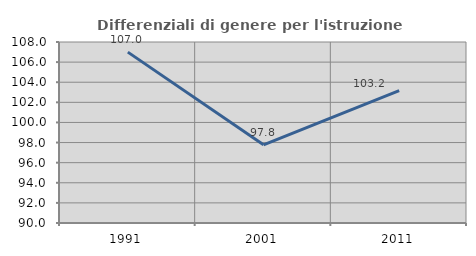
| Category | Differenziali di genere per l'istruzione superiore |
|---|---|
| 1991.0 | 106.994 |
| 2001.0 | 97.775 |
| 2011.0 | 103.168 |